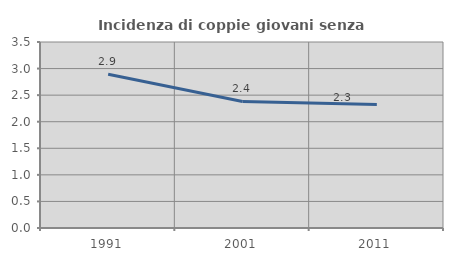
| Category | Incidenza di coppie giovani senza figli |
|---|---|
| 1991.0 | 2.894 |
| 2001.0 | 2.381 |
| 2011.0 | 2.326 |